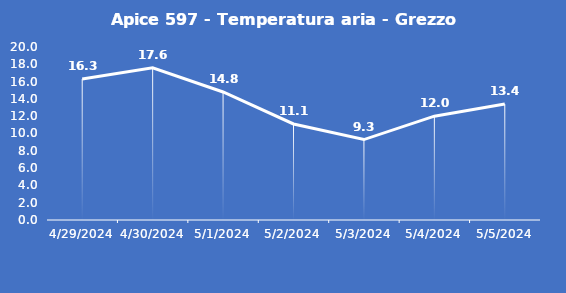
| Category | Apice 597 - Temperatura aria - Grezzo (°C) |
|---|---|
| 4/29/24 | 16.3 |
| 4/30/24 | 17.6 |
| 5/1/24 | 14.8 |
| 5/2/24 | 11.1 |
| 5/3/24 | 9.3 |
| 5/4/24 | 12 |
| 5/5/24 | 13.4 |